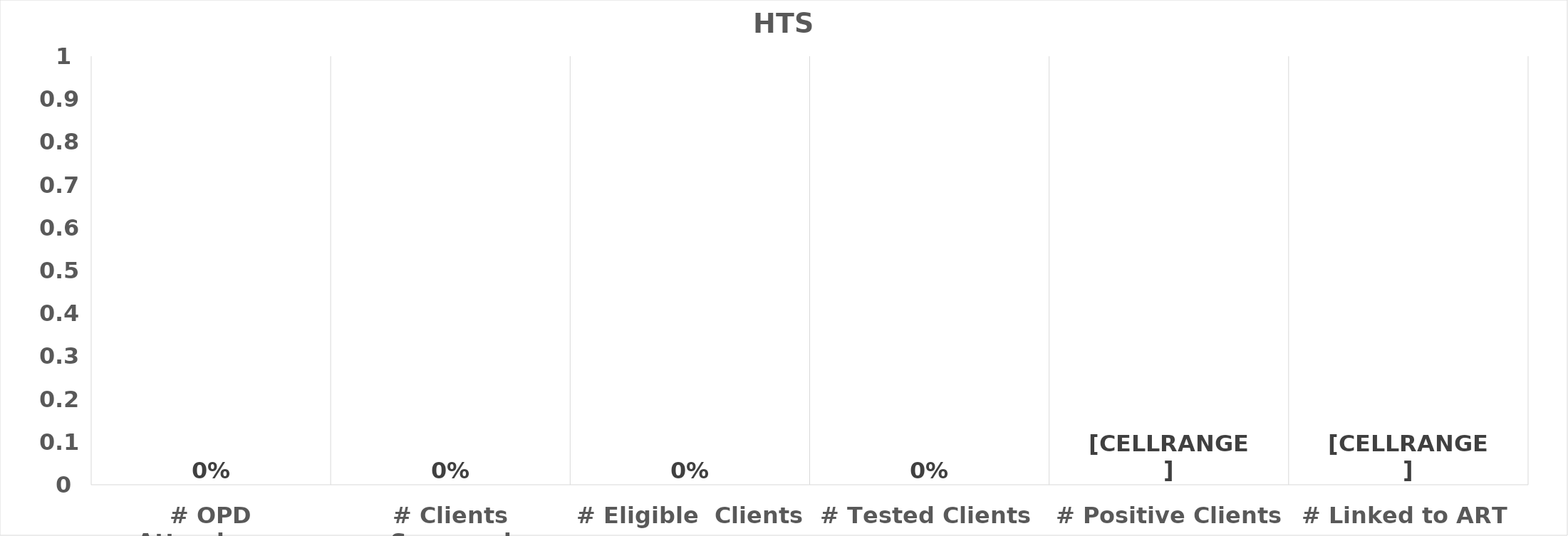
| Category | Results Achieved |
|---|---|
| # OPD Attendance | 0 |
| # Clients Screened | 0 |
| # Eligible  Clients | 0 |
| # Tested Clients | 0 |
| # Positive Clients | 0 |
| # Linked to ART | 0 |